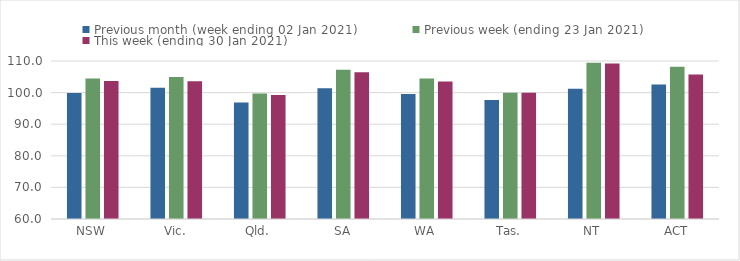
| Category | Previous month (week ending 02 Jan 2021) | Previous week (ending 23 Jan 2021) | This week (ending 30 Jan 2021) |
|---|---|---|---|
| NSW | 99.89 | 104.49 | 103.71 |
| Vic. | 101.51 | 104.97 | 103.58 |
| Qld. | 96.87 | 99.71 | 99.21 |
| SA | 101.36 | 107.21 | 106.43 |
| WA | 99.53 | 104.43 | 103.52 |
| Tas. | 97.62 | 99.98 | 99.92 |
| NT | 101.25 | 109.48 | 109.19 |
| ACT | 102.55 | 108.16 | 105.71 |